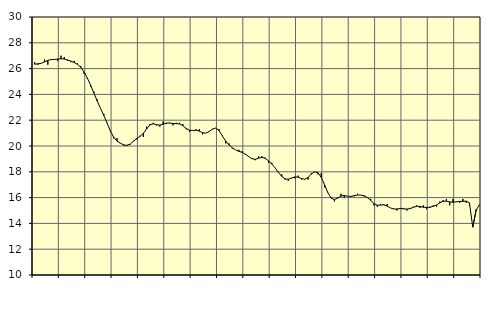
| Category | Piggar | Tillverkning o utvinning, energi o miljö, SNI 05-33, 35-39 |
|---|---|---|
| nan | 26.5 | 26.34 |
| 87.0 | 26.3 | 26.37 |
| 87.0 | 26.4 | 26.41 |
| 87.0 | 26.7 | 26.52 |
| nan | 26.3 | 26.64 |
| 88.0 | 26.7 | 26.7 |
| 88.0 | 26.7 | 26.71 |
| 88.0 | 26.6 | 26.74 |
| nan | 27 | 26.77 |
| 89.0 | 26.9 | 26.74 |
| 89.0 | 26.6 | 26.67 |
| 89.0 | 26.5 | 26.58 |
| nan | 26.6 | 26.47 |
| 90.0 | 26.4 | 26.33 |
| 90.0 | 26.2 | 26.1 |
| 90.0 | 25.6 | 25.74 |
| nan | 25.2 | 25.27 |
| 91.0 | 24.6 | 24.71 |
| 91.0 | 24.2 | 24.1 |
| 91.0 | 23.6 | 23.48 |
| nan | 22.9 | 22.91 |
| 92.0 | 22.5 | 22.37 |
| 92.0 | 21.8 | 21.77 |
| 92.0 | 21.2 | 21.16 |
| nan | 20.6 | 20.68 |
| 93.0 | 20.6 | 20.38 |
| 93.0 | 20.2 | 20.22 |
| 93.0 | 20 | 20.09 |
| nan | 20 | 20.05 |
| 94.0 | 20.1 | 20.15 |
| 94.0 | 20.4 | 20.37 |
| 94.0 | 20.5 | 20.58 |
| nan | 20.8 | 20.75 |
| 95.0 | 20.7 | 20.98 |
| 95.0 | 21.5 | 21.32 |
| 95.0 | 21.7 | 21.64 |
| nan | 21.8 | 21.72 |
| 96.0 | 21.6 | 21.65 |
| 96.0 | 21.5 | 21.62 |
| 96.0 | 21.9 | 21.69 |
| nan | 21.7 | 21.78 |
| 97.0 | 21.8 | 21.78 |
| 97.0 | 21.6 | 21.74 |
| 97.0 | 21.8 | 21.73 |
| nan | 21.8 | 21.71 |
| 98.0 | 21.7 | 21.58 |
| 98.0 | 21.3 | 21.36 |
| 98.0 | 21.1 | 21.22 |
| nan | 21.2 | 21.2 |
| 99.0 | 21.3 | 21.23 |
| 99.0 | 21.3 | 21.15 |
| 99.0 | 20.9 | 21.03 |
| nan | 21 | 21 |
| 0.0 | 21.1 | 21.13 |
| 0.0 | 21.3 | 21.32 |
| 0.0 | 21.4 | 21.39 |
| nan | 21.3 | 21.19 |
| 1.0 | 20.8 | 20.77 |
| 1.0 | 20.2 | 20.38 |
| 1.0 | 20.2 | 20.09 |
| nan | 19.8 | 19.86 |
| 2.0 | 19.7 | 19.7 |
| 2.0 | 19.7 | 19.59 |
| 2.0 | 19.6 | 19.5 |
| nan | 19.3 | 19.36 |
| 3.0 | 19.2 | 19.18 |
| 3.0 | 19 | 19.01 |
| 3.0 | 18.9 | 18.97 |
| nan | 19.2 | 19.06 |
| 4.0 | 19.2 | 19.12 |
| 4.0 | 19.1 | 19.04 |
| 4.0 | 18.7 | 18.85 |
| nan | 18.7 | 18.6 |
| 5.0 | 18.3 | 18.3 |
| 5.0 | 18 | 17.96 |
| 5.0 | 17.8 | 17.65 |
| nan | 17.4 | 17.45 |
| 6.0 | 17.3 | 17.42 |
| 6.0 | 17.5 | 17.52 |
| 6.0 | 17.5 | 17.6 |
| nan | 17.7 | 17.59 |
| 7.0 | 17.4 | 17.48 |
| 7.0 | 17.4 | 17.42 |
| 7.0 | 17.4 | 17.57 |
| nan | 17.9 | 17.82 |
| 8.0 | 18 | 18 |
| 8.0 | 17.8 | 17.93 |
| 8.0 | 17.9 | 17.57 |
| nan | 16.8 | 17.01 |
| 9.0 | 16.4 | 16.38 |
| 9.0 | 16 | 15.96 |
| 9.0 | 15.7 | 15.84 |
| nan | 16 | 15.96 |
| 10.0 | 16.3 | 16.12 |
| 10.0 | 16 | 16.16 |
| 10.0 | 16.1 | 16.11 |
| nan | 16.1 | 16.09 |
| 11.0 | 16.1 | 16.15 |
| 11.0 | 16.3 | 16.2 |
| 11.0 | 16.2 | 16.2 |
| nan | 16.2 | 16.13 |
| 12.0 | 16 | 16.01 |
| 12.0 | 15.9 | 15.79 |
| 12.0 | 15.4 | 15.54 |
| nan | 15.3 | 15.41 |
| 13.0 | 15.5 | 15.42 |
| 13.0 | 15.5 | 15.44 |
| 13.0 | 15.5 | 15.34 |
| nan | 15.2 | 15.2 |
| 14.0 | 15.1 | 15.12 |
| 14.0 | 15 | 15.12 |
| 14.0 | 15.2 | 15.15 |
| nan | 15.2 | 15.13 |
| 15.0 | 15 | 15.11 |
| 15.0 | 15.2 | 15.15 |
| 15.0 | 15.3 | 15.25 |
| nan | 15.4 | 15.33 |
| 16.0 | 15.2 | 15.31 |
| 16.0 | 15.4 | 15.25 |
| 16.0 | 15.1 | 15.24 |
| nan | 15.2 | 15.26 |
| 17.0 | 15.4 | 15.33 |
| 17.0 | 15.3 | 15.43 |
| 17.0 | 15.7 | 15.59 |
| nan | 15.8 | 15.72 |
| 18.0 | 15.9 | 15.72 |
| 18.0 | 15.4 | 15.67 |
| 18.0 | 15.9 | 15.64 |
| nan | 15.7 | 15.67 |
| 19.0 | 15.6 | 15.7 |
| 19.0 | 15.9 | 15.71 |
| 19.0 | 15.6 | 15.73 |
| nan | 15.4 | 15.59 |
| 20.0 | 13.7 | 13.71 |
| 20.0 | 15.1 | 15 |
| 20.0 | 15.4 | 15.44 |